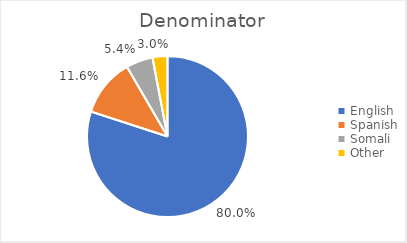
| Category |  Denominator  |
|---|---|
| English | 400 |
| Spanish | 58 |
| Somali | 27 |
| Other | 15 |